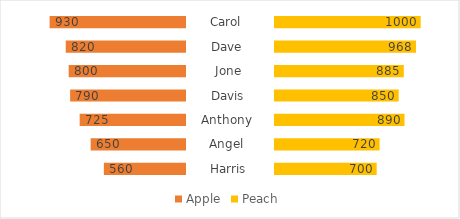
| Category | Left padding | Apple | Gap | Peach | Right padding |
|---|---|---|---|---|---|
| Harris | 640 | 560 | 600 | 700 | 500 |
| Angel  | 550 | 650 | 600 | 720 | 480 |
| Anthony  | 475 | 725 | 600 | 890 | 310 |
| Davis | 410 | 790 | 600 | 850 | 350 |
| Jone | 400 | 800 | 600 | 885 | 315 |
| Dave  | 380 | 820 | 600 | 968 | 232 |
| Carol  | 270 | 930 | 600 | 1000 | 200 |